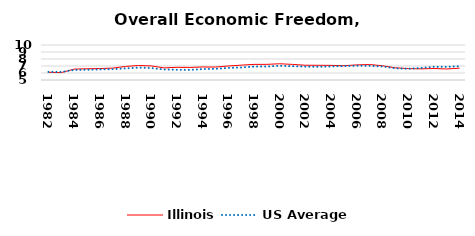
| Category | Illinois | US Average |
|---|---|---|
| 1982.0 | 6.109 | 6.149 |
| 1983.0 | 6.053 | 6.152 |
| 1984.0 | 6.559 | 6.429 |
| 1985.0 | 6.607 | 6.464 |
| 1986.0 | 6.638 | 6.512 |
| 1987.0 | 6.697 | 6.552 |
| 1988.0 | 6.936 | 6.659 |
| 1989.0 | 7.072 | 6.767 |
| 1990.0 | 7.014 | 6.71 |
| 1991.0 | 6.732 | 6.502 |
| 1992.0 | 6.811 | 6.463 |
| 1993.0 | 6.793 | 6.446 |
| 1994.0 | 6.86 | 6.563 |
| 1995.0 | 6.848 | 6.593 |
| 1996.0 | 7.003 | 6.73 |
| 1997.0 | 7.119 | 6.781 |
| 1998.0 | 7.232 | 6.926 |
| 1999.0 | 7.233 | 6.925 |
| 2000.0 | 7.321 | 7.031 |
| 2001.0 | 7.226 | 6.969 |
| 2002.0 | 7.109 | 6.912 |
| 2003.0 | 7.102 | 6.892 |
| 2004.0 | 7.089 | 6.934 |
| 2005.0 | 7.041 | 6.99 |
| 2006.0 | 7.16 | 7.048 |
| 2007.0 | 7.21 | 7.028 |
| 2008.0 | 7.035 | 6.935 |
| 2009.0 | 6.735 | 6.668 |
| 2010.0 | 6.632 | 6.605 |
| 2011.0 | 6.591 | 6.72 |
| 2012.0 | 6.643 | 6.883 |
| 2013.0 | 6.577 | 6.881 |
| 2014.0 | 6.689 | 6.973 |